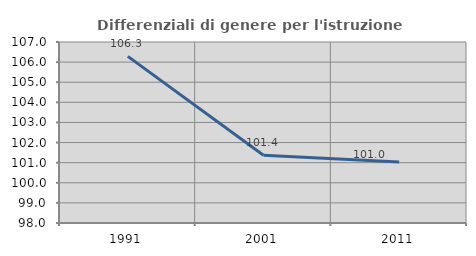
| Category | Differenziali di genere per l'istruzione superiore |
|---|---|
| 1991.0 | 106.285 |
| 2001.0 | 101.365 |
| 2011.0 | 101.037 |